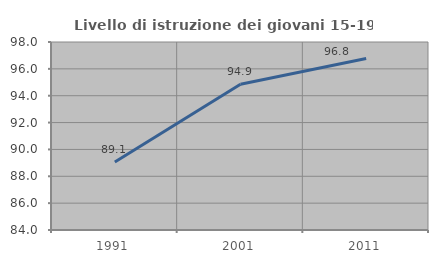
| Category | Livello di istruzione dei giovani 15-19 anni |
|---|---|
| 1991.0 | 89.058 |
| 2001.0 | 94.858 |
| 2011.0 | 96.777 |